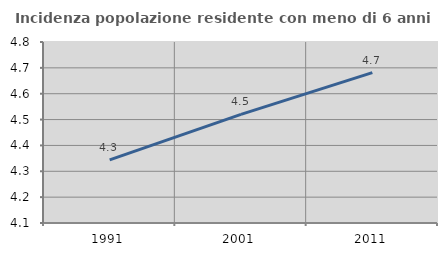
| Category | Incidenza popolazione residente con meno di 6 anni |
|---|---|
| 1991.0 | 4.344 |
| 2001.0 | 4.52 |
| 2011.0 | 4.682 |